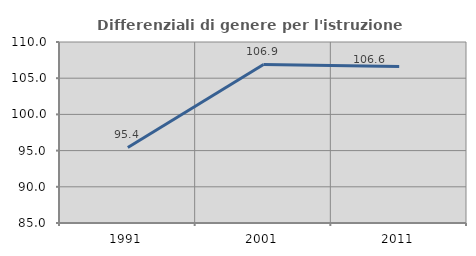
| Category | Differenziali di genere per l'istruzione superiore |
|---|---|
| 1991.0 | 95.434 |
| 2001.0 | 106.893 |
| 2011.0 | 106.613 |